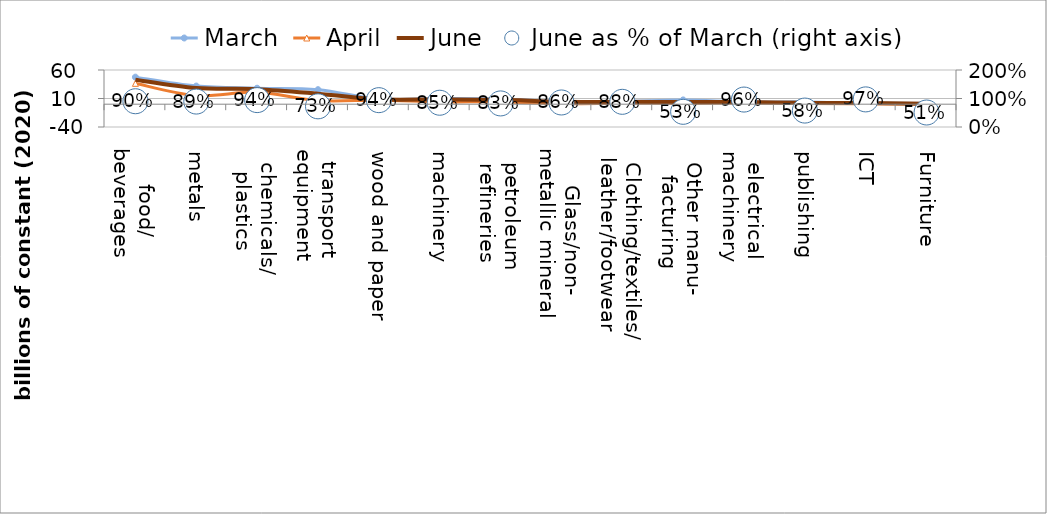
| Category | March | April | June |
|---|---|---|---|
| food/
beverages | 47.455 | 36.603 | 42.895 |
| metals | 31.796 | 15.179 | 28.384 |
| chemicals/
plastics | 28.023 | 21.118 | 26.441 |
| transport 
equipment | 25.474 | 6.389 | 18.476 |
| wood and paper | 9.078 | 7.067 | 8.55 |
| machinery | 9.927 | 4.205 | 8.448 |
| petroleum 
refineries | 9.222 | 3.938 | 7.626 |
| Glass/non-
metallic mineral | 4.831 | 0.796 | 4.155 |
| Clothing/textiles/
leather/footwear | 4.694 | 1.676 | 4.147 |
| Other manu-
facturing | 7.492 | 1.364 | 3.991 |
| electrical 
machinery | 4.042 | 2.085 | 3.892 |
| publishing  | 4.076 | 1.287 | 2.351 |
| ICT | 2.012 | 0.69 | 1.949 |
| Furniture | 1.319 | 0.152 | 0.671 |